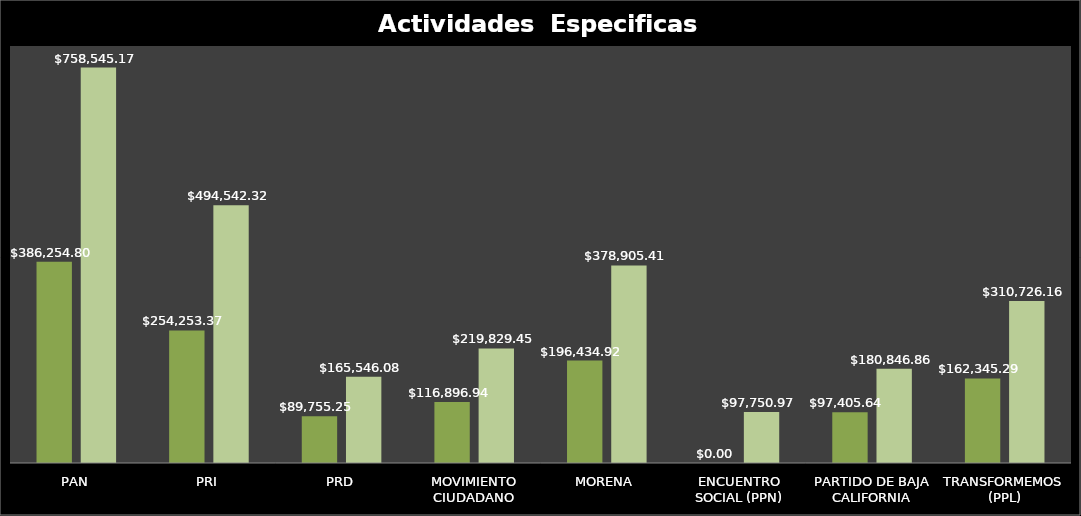
| Category | Series 0 | Series 1 |
|---|---|---|
| PAN | 386254.8 | 758545.17 |
| PRI | 254253.37 | 494542.32 |
| PRD | 89755.25 | 165546.08 |
| MOVIMIENTO CIUDADANO | 116896.94 | 219829.45 |
| MORENA | 196434.92 | 378905.41 |
| ENCUENTRO SOCIAL (PPN) | 0 | 97750.97 |
| PARTIDO DE BAJA CALIFORNIA | 97405.64 | 180846.86 |
| TRANSFORMEMOS (PPL) | 162345.29 | 310726.16 |